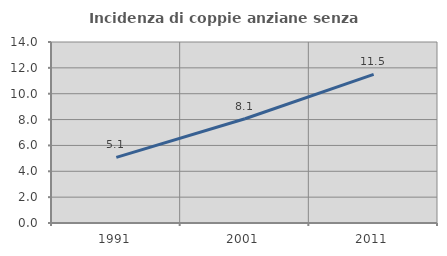
| Category | Incidenza di coppie anziane senza figli  |
|---|---|
| 1991.0 | 5.075 |
| 2001.0 | 8.061 |
| 2011.0 | 11.492 |